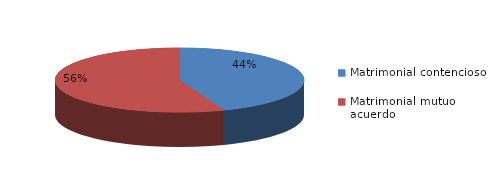
| Category | Series 0 |
|---|---|
| 0 | 696 |
| 1 | 878 |